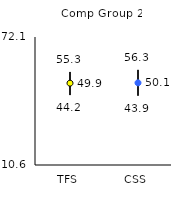
| Category | 25th | 75th | Mean |
|---|---|---|---|
| TFS | 44.2 | 55.3 | 49.92 |
| CSS | 43.9 | 56.3 | 50.08 |